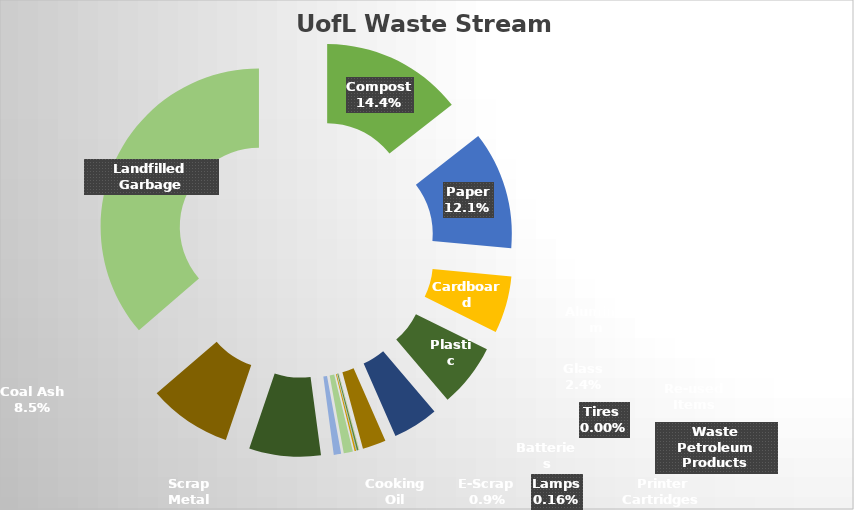
| Category | Series 0 |
|---|---|
| Compost | 1002980 |
| Paper | 838785 |
| Cardboard | 405380 |
| Plastic | 450800 |
| Aluminum | 322994 |
| Glass | 166152 |
| Re-used Items | 1549 |
| Tires  | 300 |
| Waste Petroleum Products | 1320 |
| Batteries | 11430 |
| Printer Cartridges  | 1760 |
| Lamps | 11096 |
| E-Scrap | 65076 |
| Cooking Oil | 52030 |
| Concrete | 0 |
| Scrap Metal | 508692 |
| Wood | 0 |
| Coal Ash | 590262 |
| Landfilled Garbage | 2526256 |